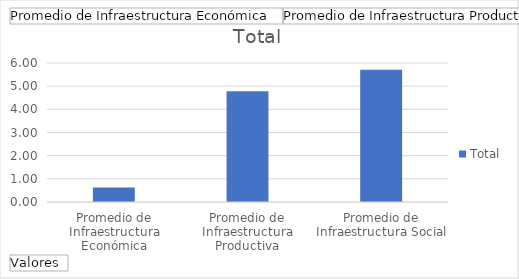
| Category | Total |
|---|---|
| Promedio de Infraestructura Económica | 0.629 |
| Promedio de Infraestructura Productiva | 4.779 |
| Promedio de Infraestructura Social | 5.709 |